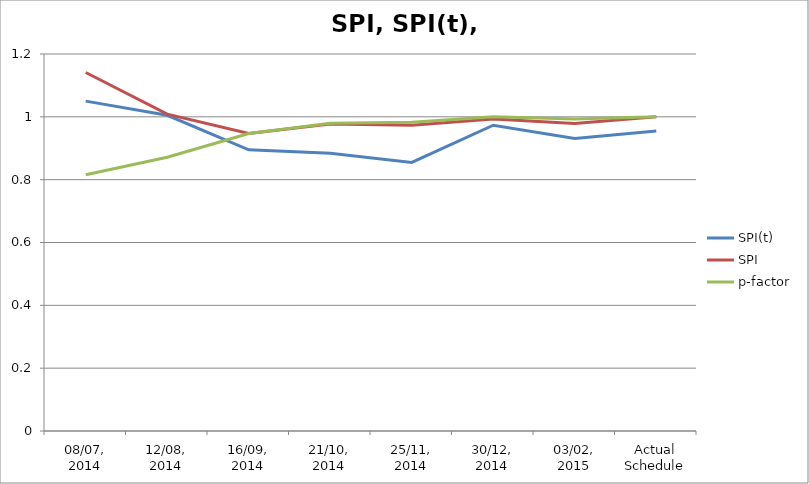
| Category | SPI(t) | SPI | p-factor |
|---|---|---|---|
| 08/07, 2014 | 1.05 | 1.141 | 0.815 |
| 12/08, 2014 | 1.005 | 1.009 | 0.871 |
| 16/09, 2014 | 0.895 | 0.947 | 0.947 |
| 21/10, 2014 | 0.884 | 0.977 | 0.979 |
| 25/11, 2014 | 0.855 | 0.973 | 0.983 |
| 30/12, 2014 | 0.973 | 0.993 | 1 |
| 03/02, 2015 | 0.931 | 0.979 | 0.993 |
| Actual Schedule | 0.955 | 1 | 1 |